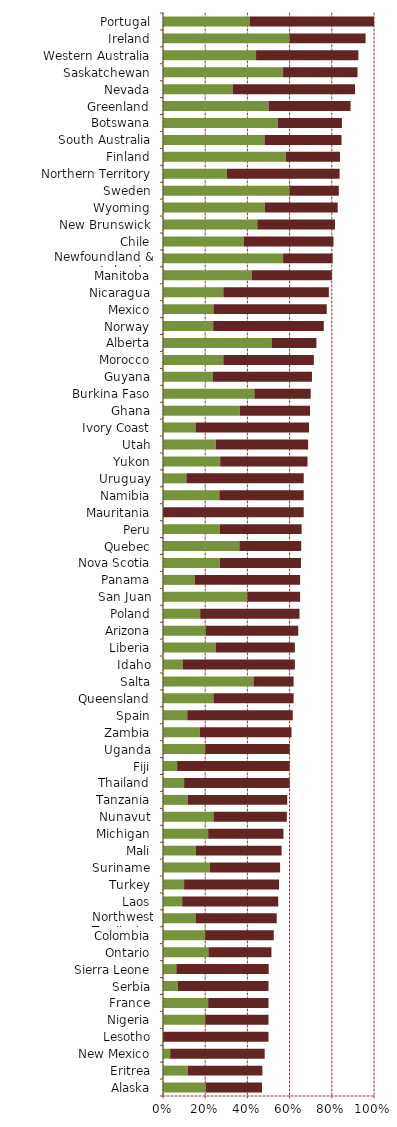
| Category | Series 0 | Series 1 |
|---|---|---|
| Alaska | 0.203 | 0.266 |
| Eritrea | 0.118 | 0.353 |
| New Mexico | 0.034 | 0.448 |
| Lesotho | 0 | 0.5 |
| Nigeria | 0.2 | 0.3 |
| France | 0.214 | 0.286 |
| Serbia | 0.071 | 0.429 |
| Sierra Leone | 0.063 | 0.438 |
| Ontario | 0.215 | 0.299 |
| Colombia | 0.2 | 0.325 |
| Northwest Territories | 0.154 | 0.385 |
| Laos | 0.091 | 0.455 |
| Turkey | 0.1 | 0.45 |
| Suriname | 0.222 | 0.333 |
| Mali | 0.156 | 0.406 |
| Michigan | 0.214 | 0.357 |
| Nunavut | 0.239 | 0.348 |
| Tanzania | 0.118 | 0.471 |
| Thailand | 0.1 | 0.5 |
| Fiji | 0.067 | 0.533 |
| Uganda | 0.2 | 0.4 |
| Zambia | 0.174 | 0.435 |
| Spain | 0.115 | 0.5 |
| Queensland | 0.239 | 0.38 |
| Salta | 0.429 | 0.19 |
| Idaho | 0.094 | 0.531 |
| Liberia | 0.25 | 0.375 |
| Arizona | 0.203 | 0.438 |
| Poland | 0.176 | 0.471 |
| San Juan | 0.4 | 0.25 |
| Panama | 0.15 | 0.5 |
| Nova Scotia | 0.269 | 0.385 |
| Quebec | 0.362 | 0.293 |
| Peru | 0.269 | 0.388 |
| Mauritania | 0 | 0.667 |
| Namibia | 0.267 | 0.4 |
| Uruguay | 0.111 | 0.556 |
| Yukon | 0.271 | 0.414 |
| Utah | 0.25 | 0.438 |
| Ivory Coast | 0.154 | 0.538 |
| Ghana | 0.364 | 0.333 |
| Burkina Faso | 0.433 | 0.267 |
| Guyana | 0.235 | 0.471 |
| Morocco | 0.286 | 0.429 |
| Alberta | 0.515 | 0.212 |
| Norway | 0.238 | 0.524 |
| Mexico | 0.239 | 0.537 |
| Nicaragua | 0.286 | 0.5 |
| Manitoba | 0.42 | 0.38 |
| Newfoundland & Labrador | 0.569 | 0.235 |
| Chile | 0.382 | 0.426 |
| New Brunswick | 0.447 | 0.368 |
| Wyoming | 0.483 | 0.345 |
| Sweden | 0.6 | 0.233 |
| Northern Territory | 0.302 | 0.535 |
| Finland | 0.581 | 0.258 |
| South Australia | 0.481 | 0.365 |
| Botswana | 0.545 | 0.303 |
| Greenland | 0.5 | 0.389 |
| Nevada | 0.33 | 0.58 |
| Saskatchewan | 0.569 | 0.353 |
| Western Australia | 0.441 | 0.485 |
| Ireland | 0.6 | 0.36 |
| Portugal | 0.412 | 0.588 |